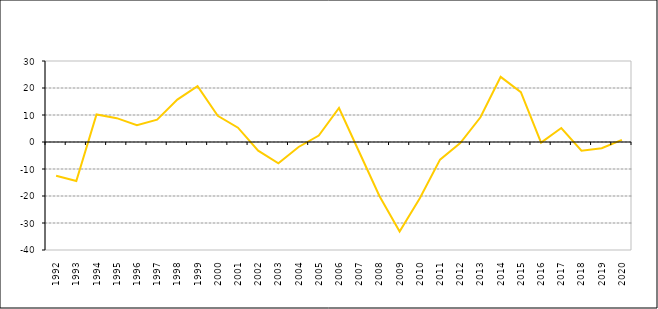
| Category | Series 0 |
|---|---|
| 1992.0 | -12.53 |
| 1993.0 | -14.43 |
| 1994.0 | 10.19 |
| 1995.0 | 8.83 |
| 1996.0 | 6.25 |
| 1997.0 | 8.3 |
| 1998.0 | 15.7 |
| 1999.0 | 20.7 |
| 2000.0 | 9.7 |
| 2001.0 | 5.3 |
| 2002.0 | -3.22 |
| 2003.0 | -7.87 |
| 2004.0 | -1.84 |
| 2005.0 | 2.38 |
| 2006.0 | 12.6 |
| 2007.0 | -3.7 |
| 2008.0 | -20 |
| 2009.0 | -33.19 |
| 2010.0 | -20.8 |
| 2011.0 | -6.533 |
| 2012.0 | -0.414 |
| 2013.0 | 9.159 |
| 2014.0 | 24.121 |
| 2015.0 | 18.433 |
| 2016.0 | -0.235 |
| 2017.0 | 5.162 |
| 2018.0 | -3.225 |
| 2019.0 | -2.304 |
| 2020.0 | 0.8 |